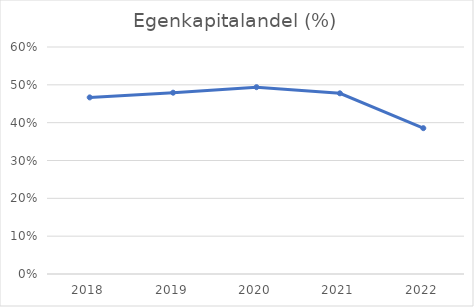
| Category | Egenkapitalandel (%) |
|---|---|
| 2018.0 | 0.467 |
| 2019.0 | 0.479 |
| 2020.0 | 0.494 |
| 2021.0 | 0.478 |
| 2022.0 | 0.385 |